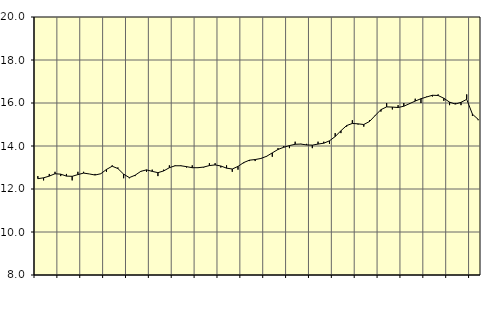
| Category | Piggar | Utbildning, SNI 85 |
|---|---|---|
| nan | 12.6 | 12.48 |
| 1.0 | 12.4 | 12.52 |
| 1.0 | 12.7 | 12.6 |
| 1.0 | 12.8 | 12.71 |
| nan | 12.6 | 12.69 |
| 2.0 | 12.7 | 12.6 |
| 2.0 | 12.4 | 12.59 |
| 2.0 | 12.8 | 12.67 |
| nan | 12.8 | 12.74 |
| 3.0 | 12.7 | 12.7 |
| 3.0 | 12.7 | 12.65 |
| 3.0 | 12.7 | 12.71 |
| nan | 12.8 | 12.91 |
| 4.0 | 13.1 | 13.06 |
| 4.0 | 13 | 12.95 |
| 4.0 | 12.5 | 12.69 |
| nan | 12.5 | 12.53 |
| 5.0 | 12.6 | 12.64 |
| 5.0 | 12.8 | 12.82 |
| 5.0 | 12.8 | 12.89 |
| nan | 12.9 | 12.82 |
| 6.0 | 12.6 | 12.76 |
| 6.0 | 12.9 | 12.84 |
| 6.0 | 13.1 | 12.99 |
| nan | 13.1 | 13.08 |
| 7.0 | 13.1 | 13.08 |
| 7.0 | 13 | 13.04 |
| 7.0 | 13.1 | 12.99 |
| nan | 13 | 12.99 |
| 8.0 | 13 | 13.02 |
| 8.0 | 13.2 | 13.09 |
| 8.0 | 13.2 | 13.12 |
| nan | 13 | 13.07 |
| 9.0 | 13.1 | 12.97 |
| 9.0 | 12.8 | 12.93 |
| 9.0 | 12.9 | 13.05 |
| nan | 13.2 | 13.23 |
| 10.0 | 13.3 | 13.34 |
| 10.0 | 13.3 | 13.37 |
| 10.0 | 13.4 | 13.42 |
| nan | 13.5 | 13.52 |
| 11.0 | 13.5 | 13.68 |
| 11.0 | 13.9 | 13.84 |
| 11.0 | 14 | 13.94 |
| nan | 13.9 | 14.02 |
| 12.0 | 14.2 | 14.08 |
| 12.0 | 14.1 | 14.09 |
| 12.0 | 14.1 | 14.05 |
| nan | 13.9 | 14.04 |
| 13.0 | 14.2 | 14.09 |
| 13.0 | 14.2 | 14.13 |
| 13.0 | 14.1 | 14.24 |
| nan | 14.6 | 14.44 |
| 14.0 | 14.6 | 14.71 |
| 14.0 | 14.9 | 14.95 |
| 14.0 | 15.2 | 15.05 |
| nan | 15 | 15.03 |
| 15.0 | 14.9 | 15 |
| 15.0 | 15.2 | 15.14 |
| 15.0 | 15.4 | 15.42 |
| nan | 15.6 | 15.69 |
| 16.0 | 16 | 15.82 |
| 16.0 | 15.7 | 15.81 |
| 16.0 | 15.9 | 15.79 |
| nan | 16 | 15.85 |
| 17.0 | 16 | 15.97 |
| 17.0 | 16.2 | 16.09 |
| 17.0 | 16 | 16.2 |
| nan | 16.3 | 16.28 |
| 18.0 | 16.3 | 16.36 |
| 18.0 | 16.4 | 16.35 |
| 18.0 | 16.1 | 16.22 |
| nan | 15.9 | 16.04 |
| 19.0 | 16 | 15.95 |
| 19.0 | 15.9 | 16.03 |
| 19.0 | 16.4 | 16.17 |
| nan | 15.4 | 15.48 |
| 20.0 | 15.2 | 15.24 |